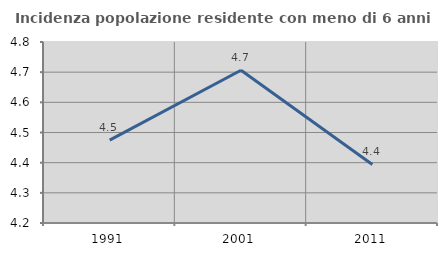
| Category | Incidenza popolazione residente con meno di 6 anni |
|---|---|
| 1991.0 | 4.475 |
| 2001.0 | 4.706 |
| 2011.0 | 4.394 |